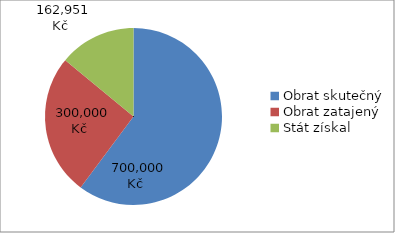
| Category | Series 0 |
|---|---|
| Obrat skutečný | 700000 |
| Obrat zatajený | 300000 |
| Stát získal | 162950.864 |